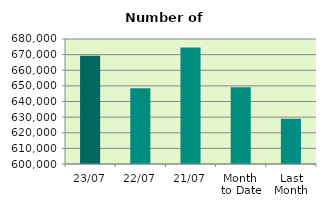
| Category | Series 0 |
|---|---|
| 23/07 | 669230 |
| 22/07 | 648456 |
| 21/07 | 674566 |
| Month 
to Date | 649144 |
| Last
Month | 628899 |